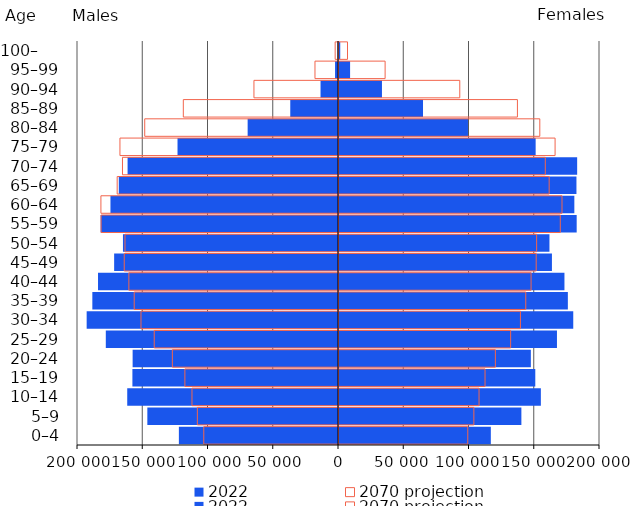
| Category | 2022 | 2070 projection |
|---|---|---|
| 0–4 | 116348 | 98675 |
| 5–9 | 139754 | 103340 |
| 10–14 | 154687 | 107315 |
| 15–19 | 150416 | 111910 |
| 20–24 | 147012 | 119832 |
| 25–29 | 167020 | 131518 |
| 30–34 | 179506 | 139035 |
| 35–39 | 175371 | 143112 |
| 40–44 | 172759 | 147183 |
| 45–49 | 163165 | 151106 |
| 50–54 | 161264 | 151443 |
| 55–59 | 182134 | 169578 |
| 60–64 | 180339 | 170887 |
| 65–69 | 181956 | 161040 |
| 70–74 | 182494 | 158084 |
| 75–79 | 150690 | 165589 |
| 80–84 | 98839 | 153874 |
| 85–89 | 64374 | 136731 |
| 90–94 | 32918 | 92552 |
| 95–99 | 8498 | 35341 |
| 100–     | 949 | 6515 |